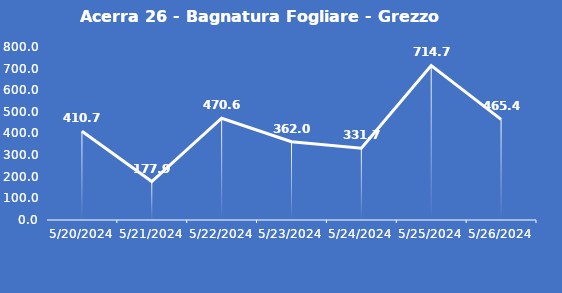
| Category | Acerra 26 - Bagnatura Fogliare - Grezzo (min) |
|---|---|
| 5/20/24 | 410.7 |
| 5/21/24 | 177.9 |
| 5/22/24 | 470.6 |
| 5/23/24 | 362 |
| 5/24/24 | 331.7 |
| 5/25/24 | 714.7 |
| 5/26/24 | 465.4 |